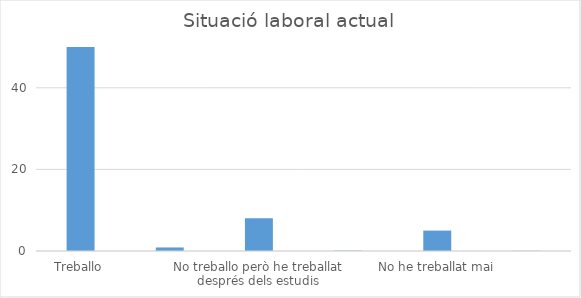
| Category | Series 0 |
|---|---|
| Treballo | 84 |
|  | 0.866 |
| No treballo però he treballat després dels estudis | 8 |
|  | 0.082 |
| No he treballat mai | 5 |